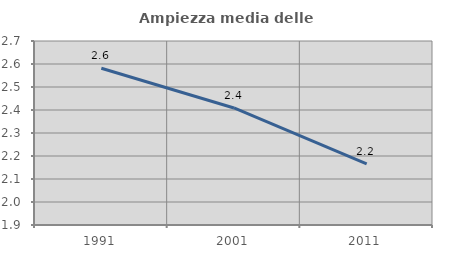
| Category | Ampiezza media delle famiglie |
|---|---|
| 1991.0 | 2.582 |
| 2001.0 | 2.409 |
| 2011.0 | 2.165 |